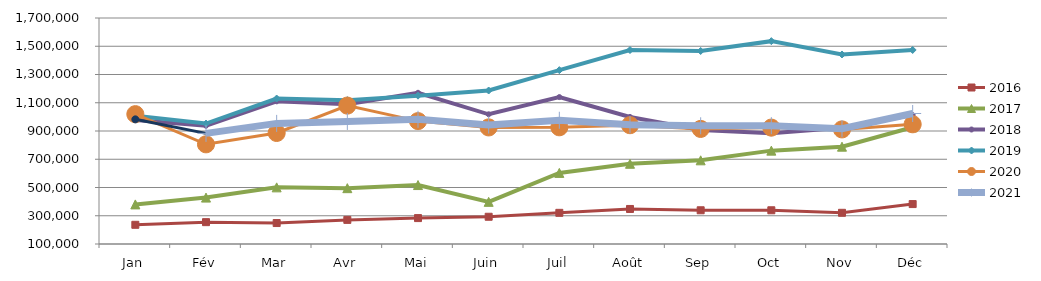
| Category | 2015 | 2016 | 2017 | 2018 | 2019 | 2020 | 2021 |
|---|---|---|---|---|---|---|---|
| Jan |  | 235903.093 | 380222.25 | 978468.279 | 1007982.373 | 1019103.465 | 982555.093 |
| Fév |  | 254650.591 | 428502.997 | 937137.209 | 952616.766 | 805837.355 | 883272.289 |
| Mar |  | 248425.98 | 500955.694 | 1110199.711 | 1129815.679 | 886115.696 | 953969.676 |
| Avr |  | 270687.752 | 495255.535 | 1090229.308 | 1118398.221 | 1079723.465 | 967473.972 |
| Mai |  | 283507.34 | 517298.538 | 1170512.154 | 1150217.455 | 970040.088 | 982779.252 |
| Juin |  | 292820.053 | 398427.247 | 1018295.812 | 1186623.687 | 925406.896 | 941931.836 |
| Juil |  | 320615.91 | 603419.402 | 1140133.118 | 1330812.699 | 926286.755 | 976002.038 |
| Août |  | 348014.816 | 667973.667 | 999343.146 | 1473280.035 | 941195.84 | 944349.197 |
| Sep |  | 338807.949 | 692403.495 | 907808.882 | 1466448.158 | 914678.196 | 937034.569 |
| Oct |  | 338820.212 | 760969.174 | 883825.979 | 1536100.268 | 923984.732 | 937856.38 |
| Nov |  | 320858.147 | 789037.665 | 922678.039 | 1441770.199 | 911296.416 | 916487.725 |
| Déc |  | 382727.181 | 926372.399 | 1012620.724 | 1473565.92 | 947568.113 | 1024000.752 |